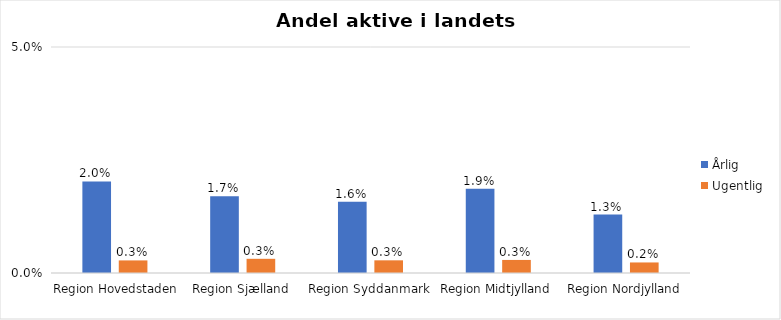
| Category | Årlig | Ugentlig |
|---|---|---|
| Region Hovedstaden | 0.02 | 0.003 |
| Region Sjælland | 0.017 | 0.003 |
| Region Syddanmark | 0.016 | 0.003 |
| Region Midtjylland | 0.019 | 0.003 |
| Region Nordjylland | 0.013 | 0.002 |